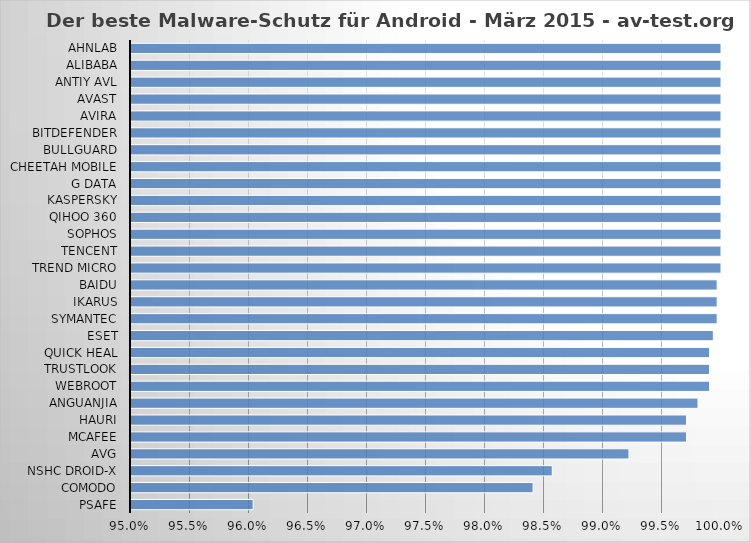
| Category | Series 0 |
|---|---|
| PSafe | 0.96 |
| Comodo | 0.984 |
| NSHC Droid-X | 0.986 |
| AVG | 0.992 |
| McAfee | 0.997 |
| Hauri | 0.997 |
| Anguanjia | 0.998 |
| Webroot | 0.999 |
| Trustlook | 0.999 |
| Quick Heal | 0.999 |
| ESET | 0.999 |
| Symantec | 1 |
| Ikarus | 1 |
| Baidu | 1 |
| Trend Micro | 1 |
| Tencent | 1 |
| Sophos | 1 |
| Qihoo 360 | 1 |
| Kaspersky | 1 |
| G Data | 1 |
| Cheetah Mobile | 1 |
| BullGuard | 1 |
| Bitdefender | 1 |
| Avira | 1 |
| Avast | 1 |
| Antiy AVL | 1 |
| Alibaba | 1 |
| AhnLab | 1 |